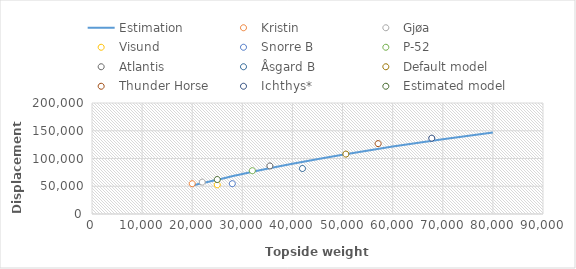
| Category | Estimation |
|---|---|
| 20000.0 | 51348 |
| 30000.0 | 72201 |
| 40000.0 | 90597 |
| 50000.0 | 106946 |
| 60000.0 | 121572 |
| 70000.0 | 134734 |
| 80000.0 | 146641 |